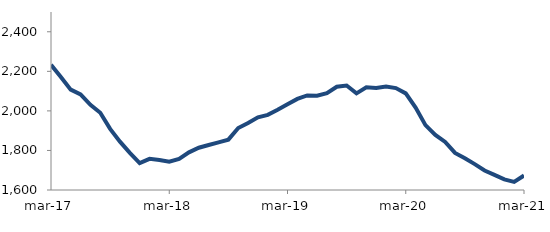
| Category | Series 0 |
|---|---|
| 2017-03-01 | 2233.177 |
| 2017-04-01 | 2171.85 |
| 2017-05-01 | 2107.618 |
| 2017-06-01 | 2083.325 |
| 2017-07-01 | 2030.99 |
| 2017-08-01 | 1990.738 |
| 2017-09-01 | 1908.873 |
| 2017-10-01 | 1844.49 |
| 2017-11-01 | 1788.112 |
| 2017-12-01 | 1736.148 |
| 2018-01-01 | 1757.409 |
| 2018-02-01 | 1751.839 |
| 2018-03-01 | 1742.835 |
| 2018-04-01 | 1757.68 |
| 2018-05-01 | 1790.41 |
| 2018-06-01 | 1813.611 |
| 2018-07-01 | 1827.454 |
| 2018-08-01 | 1840.806 |
| 2018-09-01 | 1854.733 |
| 2018-10-01 | 1913.472 |
| 2018-11-01 | 1938.819 |
| 2018-12-01 | 1967.481 |
| 2019-01-01 | 1980.122 |
| 2019-02-01 | 2005.664 |
| 2019-03-01 | 2033.637 |
| 2019-04-01 | 2060.76 |
| 2019-05-01 | 2078.07 |
| 2019-06-01 | 2076.377 |
| 2019-07-01 | 2089.152 |
| 2019-08-01 | 2121.901 |
| 2019-09-01 | 2128.491 |
| 2019-10-01 | 2088.553 |
| 2019-11-01 | 2119.211 |
| 2019-12-01 | 2116.27 |
| 2020-01-01 | 2123.179 |
| 2020-02-01 | 2115.217 |
| 2020-03-01 | 2088.6 |
| 2020-04-01 | 2017.196 |
| 2020-05-01 | 1928.056 |
| 2020-06-01 | 1878.793 |
| 2020-07-01 | 1843.079 |
| 2020-08-01 | 1787.318 |
| 2020-09-01 | 1760.041 |
| 2020-10-01 | 1730.797 |
| 2020-11-01 | 1698.405 |
| 2020-12-01 | 1676.693 |
| 2021-01-01 | 1653.561 |
| 2021-02-01 | 1641.346 |
| 2021-03-01 | 1673.136 |